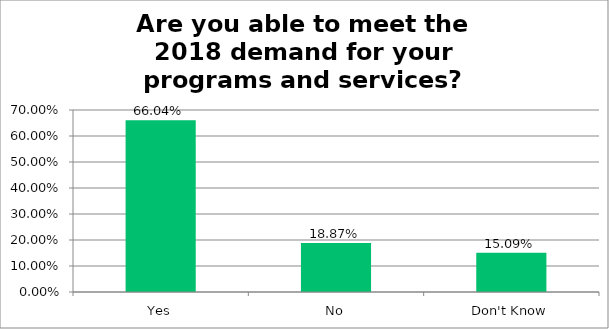
| Category | Responses |
|---|---|
| Yes | 0.66 |
| No | 0.189 |
| Don't Know | 0.151 |